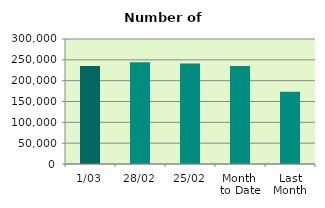
| Category | Series 0 |
|---|---|
| 1/03 | 235080 |
| 28/02 | 244150 |
| 25/02 | 241330 |
| Month 
to Date | 235080 |
| Last
Month | 173197.3 |